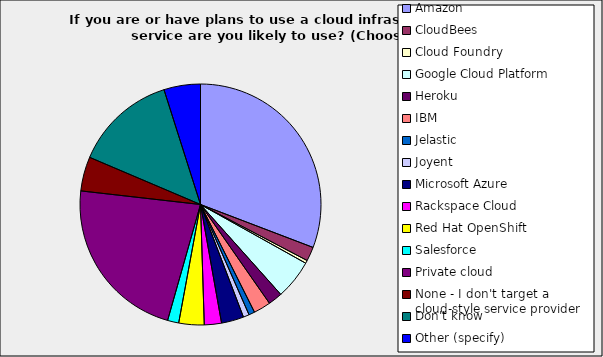
| Category | Series 0 |
|---|---|
| Amazon | 0.308 |
| CloudBees | 0.019 |
| Cloud Foundry | 0.004 |
| Google Cloud Platform | 0.053 |
| Heroku | 0.019 |
| IBM | 0.023 |
| Jelastic | 0.008 |
| Joyent | 0.008 |
| Microsoft Azure | 0.03 |
| Rackspace Cloud | 0.023 |
| Red Hat OpenShift | 0.034 |
| Salesforce | 0.015 |
| Private cloud | 0.224 |
| None - I don't target a cloud-style service provider | 0.046 |
| Don't know | 0.137 |
| Other (specify) | 0.049 |